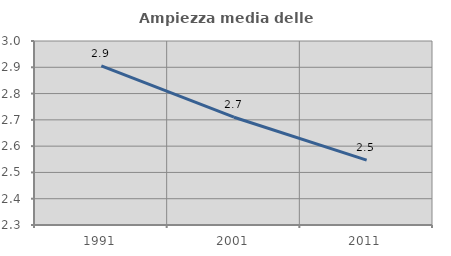
| Category | Ampiezza media delle famiglie |
|---|---|
| 1991.0 | 2.905 |
| 2001.0 | 2.71 |
| 2011.0 | 2.547 |